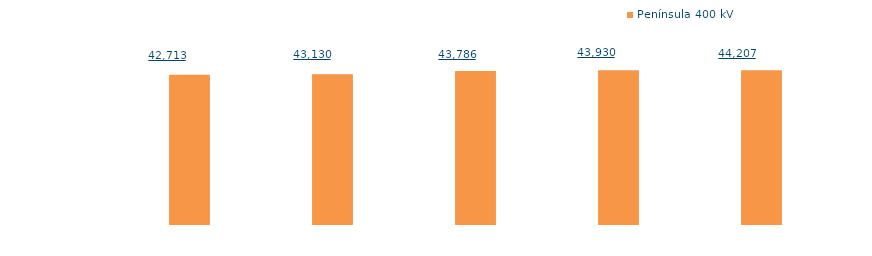
| Category | Península 400 kV |
|---|---|
| 2014 | 21093.512 |
| 2015 | 21183.826 |
| 2016 | 21618.968 |
| 2017 | 21727.929 |
| 2018 (1) | 21729.689 |